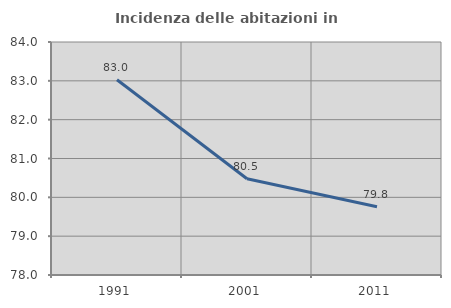
| Category | Incidenza delle abitazioni in proprietà  |
|---|---|
| 1991.0 | 83.028 |
| 2001.0 | 80.478 |
| 2011.0 | 79.757 |